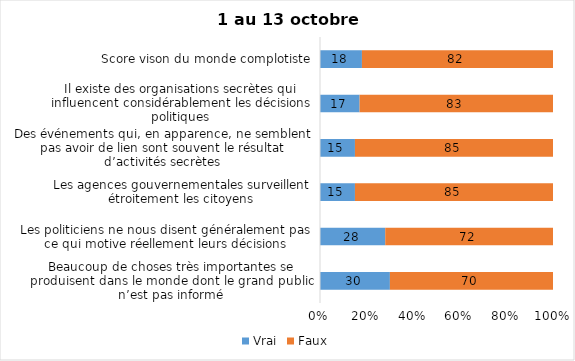
| Category | Vrai | Faux |
|---|---|---|
| Beaucoup de choses très importantes se produisent dans le monde dont le grand public n’est pas informé | 30 | 70 |
| Les politiciens ne nous disent généralement pas ce qui motive réellement leurs décisions | 28 | 72 |
| Les agences gouvernementales surveillent étroitement les citoyens | 15 | 85 |
| Des événements qui, en apparence, ne semblent pas avoir de lien sont souvent le résultat d’activités secrètes | 15 | 85 |
| Il existe des organisations secrètes qui influencent considérablement les décisions politiques | 17 | 83 |
| Score vison du monde complotiste | 18 | 82 |